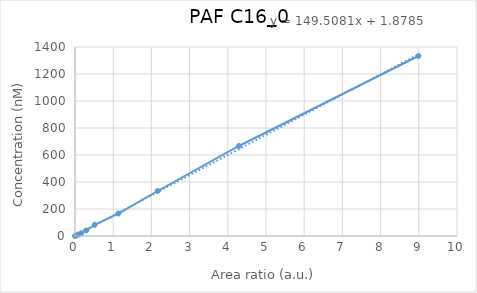
| Category | PAF C16_0 |
|---|---|
| 0.0 | 0 |
| 0.0431501 | 5.208 |
| 0.084383 | 10.417 |
| 0.162679 | 20.833 |
| 0.293461 | 41.667 |
| 0.51603 | 83.333 |
| 1.13505 | 166.667 |
| 2.1618 | 333.333 |
| 4.29018 | 666.667 |
| 8.98905 | 1333.333 |